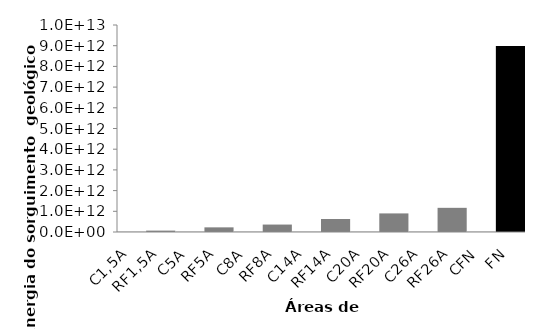
| Category | Series 0 |
|---|---|
| C1,5A | 44912985274.431 |
| RF1,5A | 67369477911.647 |
| C5A | 44912985274.431 |
| RF5A | 224564926372.155 |
| C8A | 44912985274.431 |
| RF8A | 359303882195.448 |
| C14A | 44912985274.431 |
| RF14A | 628781793842.035 |
| C20A | 44912985274.431 |
| RF20A | 898259705488.621 |
| C26A | 44912985274.431 |
| RF26A | 1167737617135.208 |
| CFN | 44912985274.431 |
| FN | 8982597054886.213 |